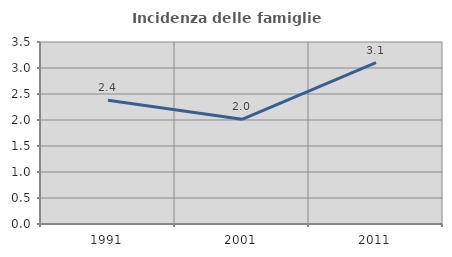
| Category | Incidenza delle famiglie numerose |
|---|---|
| 1991.0 | 2.381 |
| 2001.0 | 2.013 |
| 2011.0 | 3.103 |